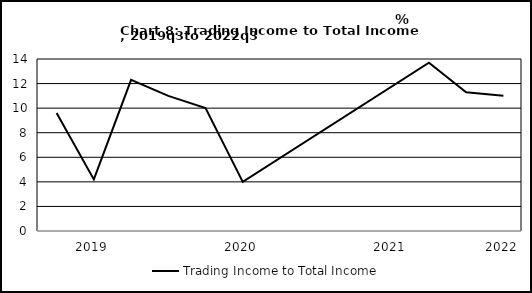
| Category | Trading Income to Total Income |
|---|---|
| nan | 9.6 |
| 2019.0 | 4.2 |
| nan | 12.3 |
| nan | 11 |
| nan | 10 |
| 2020.0 | 4 |
| nan | 0 |
| nan | 0 |
| nan | 0 |
| 2021.0 | 0 |
| nan | 13.7 |
| nan | 11.3 |
| 2022.0 | 11 |